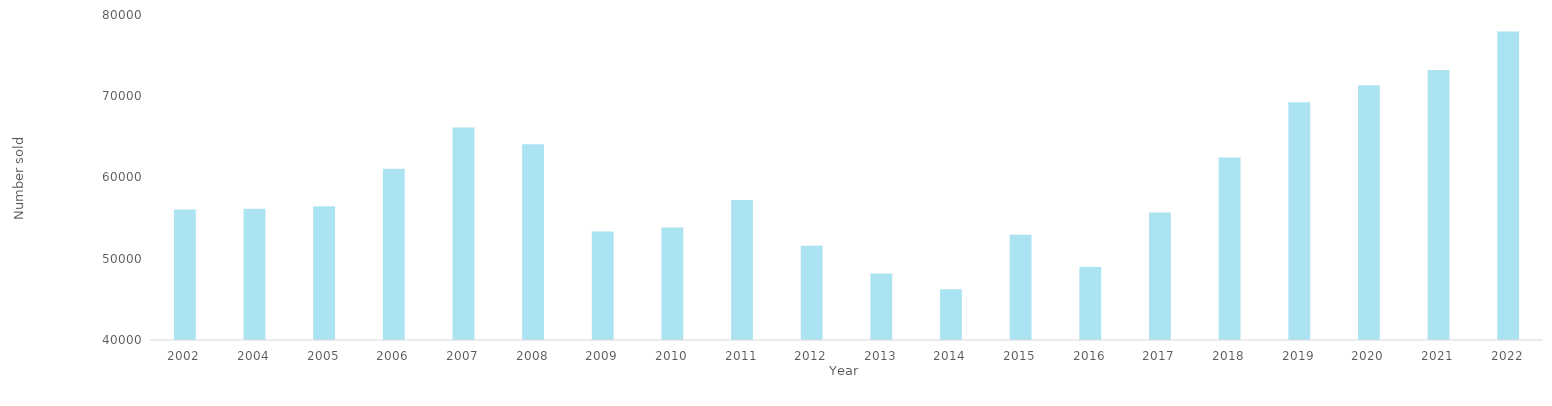
| Category | Series 0 |
|---|---|
| 2002.0 | 56065 |
| 2004.0 | 56166 |
| 2005.0 | 56453 |
| 2006.0 | 61075 |
| 2007.0 | 66156 |
| 2008.0 | 64094 |
| 2009.0 | 53369 |
| 2010.0 | 53831 |
| 2011.0 | 57231 |
| 2012.0 | 51603 |
| 2013.0 | 48189 |
| 2014.0 | 46232 |
| 2015.0 | 52950 |
| 2016.0 | 48970 |
| 2017.0 | 55699 |
| 2018.0 | 62464 |
| 2019.0 | 69270 |
| 2020.0 | 71345 |
| 2021.0 | 73238 |
| 2022.0 | 77973 |